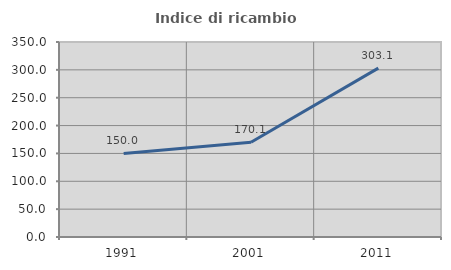
| Category | Indice di ricambio occupazionale  |
|---|---|
| 1991.0 | 150 |
| 2001.0 | 170.115 |
| 2011.0 | 303.077 |